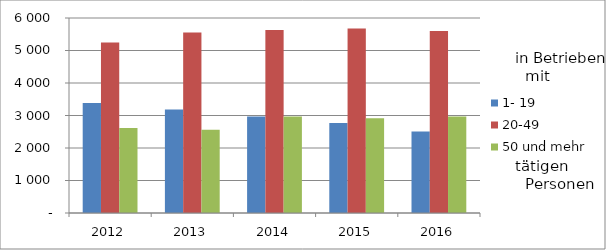
| Category | 1- 19 | 20-49 | 50 und mehr |
|---|---|---|---|
| 2012.0 | 3388 | 5244 | 2616 |
| 2013.0 | 3184 | 5551 | 2562 |
| 2014.0 | 2973 | 5631 | 2973 |
| 2015.0 | 2771 | 5678 | 2913 |
| 2016.0 | 2511 | 5598 | 2967 |